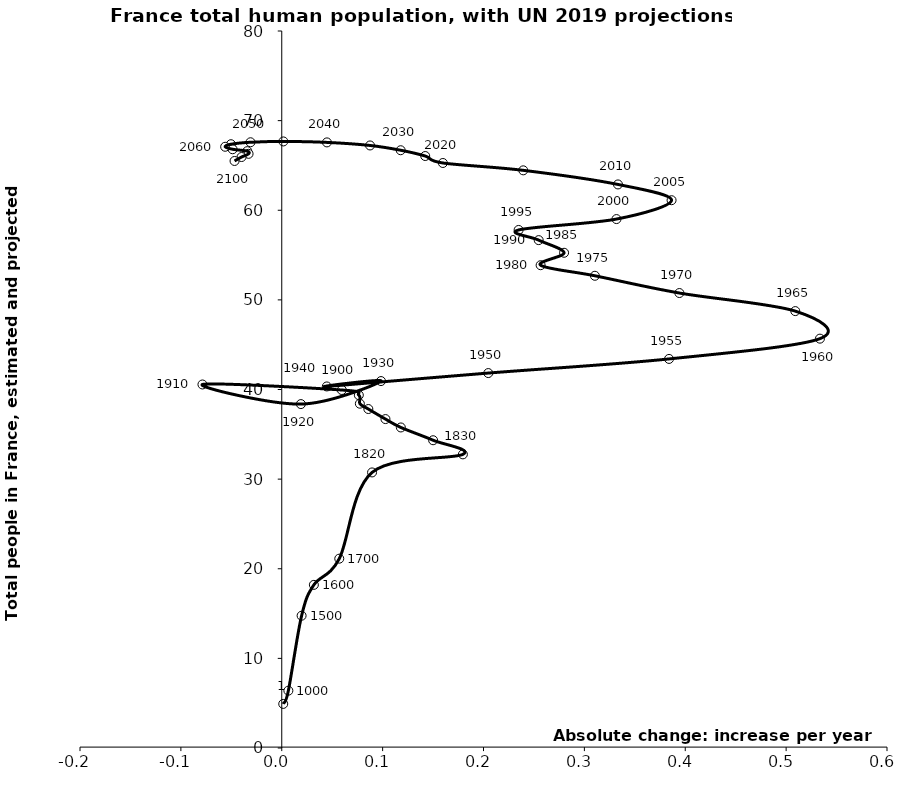
| Category | Series 0 |
|---|---|
| 0.0014758648807563866 | 4.92 |
| 0.006563775320241881 | 6.395 |
| 0.01967819841008516 | 14.759 |
| 0.031834405477915266 | 18.202 |
| 0.057022052211042215 | 21.126 |
| 0.08952823422803738 | 30.747 |
| 0.17956356049202657 | 32.764 |
| 0.15004626287689932 | 34.338 |
| 0.1180691904605112 | 35.765 |
| 0.10281858669269503 | 36.7 |
| 0.0858461405639968 | 37.821 |
| 0.07743371074368569 | 38.417 |
| 0.0764006053271558 | 39.37 |
| 0.05952655019050716 | 39.945 |
| -0.07861440264829049 | 40.561 |
| 0.018989461465732306 | 38.372 |
| 0.09839099205042565 | 40.94 |
| 0.04466951039089295 | 40.34 |
| 0.20473735062169615 | 41.834 |
| 0.38392639999999645 | 43.411 |
| 0.5335284999999977 | 45.673 |
| 0.5090774000000003 | 48.747 |
| 0.39419239999999645 | 50.764 |
| 0.3104089000000002 | 52.689 |
| 0.2566272000000069 | 53.868 |
| 0.27988399999999913 | 55.255 |
| 0.25470440000000066 | 56.667 |
| 0.23482470000000005 | 57.802 |
| 0.3318234999999966 | 59.015 |
| 0.38644339999999955 | 61.12 |
| 0.33330729999999986 | 62.88 |
| 0.2393981000000025 | 64.453 |
| 0.1597404999999938 | 65.274 |
| 0.14221909999999838 | 66.051 |
| 0.11788620000000663 | 66.696 |
| 0.0875210000000024 | 67.229 |
| 0.04479239999999862 | 67.571 |
| 0.001581599999998673 | 67.677 |
| -0.030969000000000337 | 67.587 |
| -0.05036460000000176 | 67.368 |
| -0.05610029999999426 | 67.083 |
| -0.04871569999999821 | 66.807 |
| -0.034135533333337284 | 66.596 |
| -0.03289505000000119 | 66.295 |
| -0.03984459999999927 | 65.938 |
| -0.046794149999997356 | 65.498 |